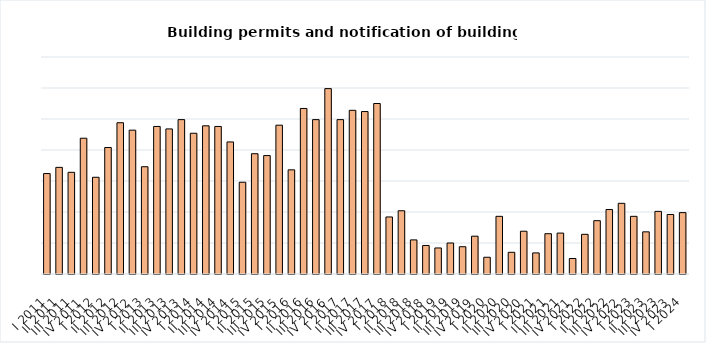
| Category | Building permits and notification of building work |
|---|---|
| I 2011 | 162 |
| II 2011 | 172 |
| III 2011 | 164 |
| IV 2011 | 219 |
| I 2012 | 156 |
| II 2012 | 204 |
| III 2012 | 244 |
| IV 2012 | 232 |
| I 2013 | 173 |
| II 2013 | 238 |
| III 2013 | 234 |
| IV 2013 | 249 |
| I 2014 | 227 |
| II 2014 | 239 |
| III 2014 | 238 |
| IV 2014 | 213 |
| I 2015 | 148 |
| II 2015 | 194 |
| III 2015 | 191 |
| IV 2015 | 240 |
| I 2016 | 168 |
| II 2016 | 267 |
| III 2016 | 249 |
| IV 2016 | 299 |
| I 2017 | 249 |
| II 2017 | 264 |
| III 2017 | 262 |
| IV 2017 | 275 |
| I 2018 | 92 |
| II 2018 | 102 |
| III 2018 | 55 |
| IV 2018 | 46 |
| I 2019 | 42 |
| II 2019 | 50 |
| III 2019 | 44 |
| IV 2019 | 61 |
| I 2020 | 27 |
| II 2020 | 93 |
| III 2020 | 35 |
| IV 2020 | 69 |
| I 2021 | 34 |
| II 2021 | 65 |
| III 2021 | 66 |
| IV 2021 | 25 |
| I 2022 | 64 |
| II 2022 | 86 |
| III 2022 | 104 |
| IV 2022 | 114 |
| I 2023 | 93 |
| II 2023 | 68 |
| III 2023 | 101 |
| IV 2023 | 96 |
| I 2024 | 99 |